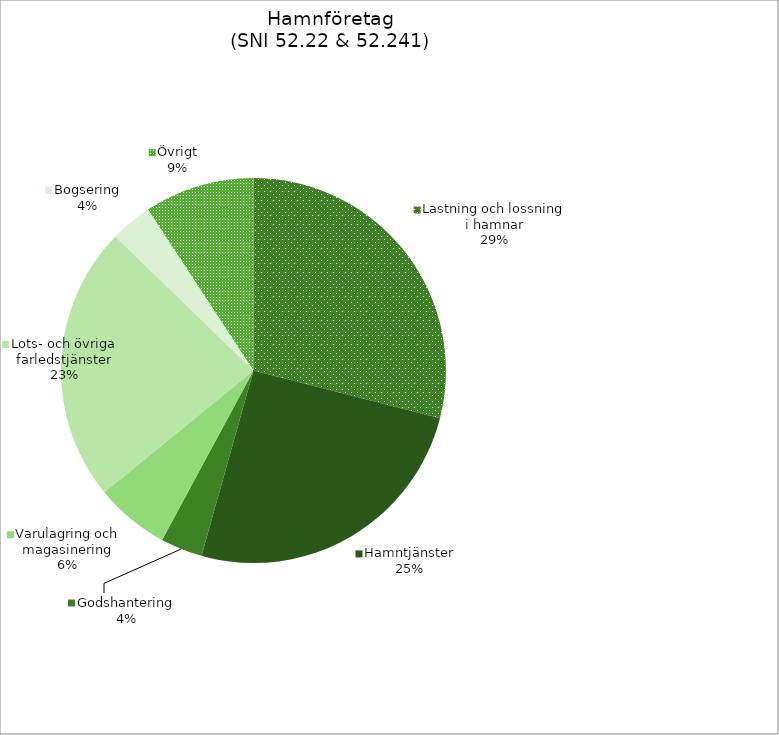
| Category | Lastning och lossning i hamnar |
|---|---|
| Lastning och lossning i hamnar | 2827.245 |
| Hamntjänster | 2473.272 |
| Godshantering | 343.658 |
| Varulagring och magasinering | 607.109 |
| Lots- och övriga farledstjänster | 2258.707 |
| Bogsering | 341.743 |
| Övrigt | 900.004 |